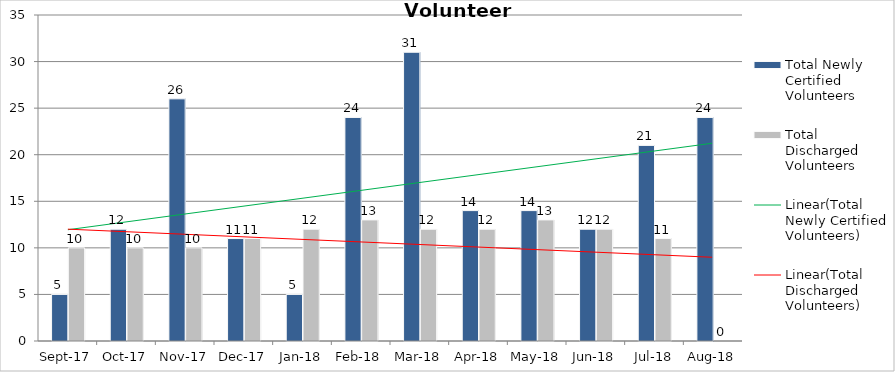
| Category | Total Newly Certified Volunteers | Total Discharged Volunteers |
|---|---|---|
| 2017-09-01 | 5 | 10 |
| 2017-10-01 | 12 | 10 |
| 2017-11-01 | 26 | 10 |
| 2017-12-01 | 11 | 11 |
| 2018-01-01 | 5 | 12 |
| 2018-02-01 | 24 | 13 |
| 2018-03-01 | 31 | 12 |
| 2018-04-01 | 14 | 12 |
| 2018-05-01 | 14 | 13 |
| 2018-06-01 | 12 | 12 |
| 2018-07-01 | 21 | 11 |
| 2018-08-01 | 24 | 0 |